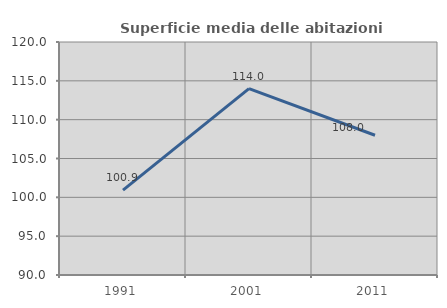
| Category | Superficie media delle abitazioni occupate |
|---|---|
| 1991.0 | 100.929 |
| 2001.0 | 114 |
| 2011.0 | 107.993 |